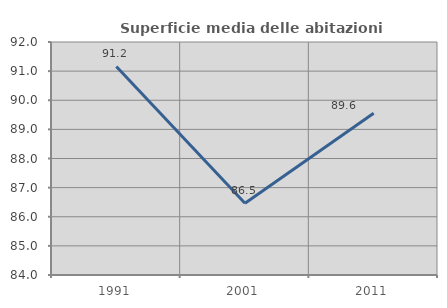
| Category | Superficie media delle abitazioni occupate |
|---|---|
| 1991.0 | 91.16 |
| 2001.0 | 86.466 |
| 2011.0 | 89.551 |